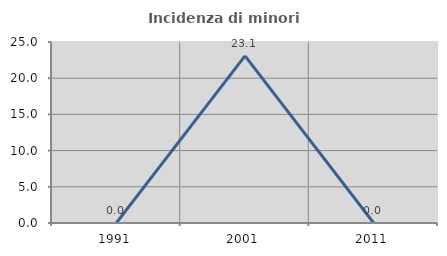
| Category | Incidenza di minori stranieri |
|---|---|
| 1991.0 | 0 |
| 2001.0 | 23.077 |
| 2011.0 | 0 |